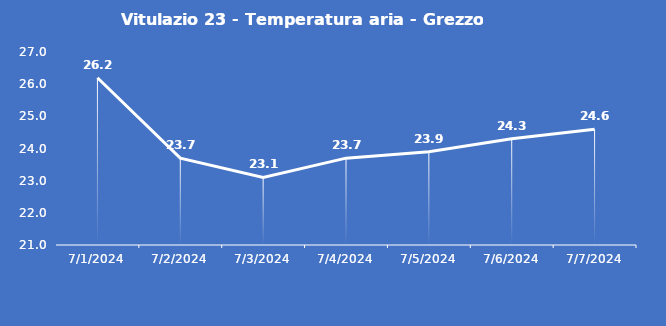
| Category | Vitulazio 23 - Temperatura aria - Grezzo (°C) |
|---|---|
| 7/1/24 | 26.2 |
| 7/2/24 | 23.7 |
| 7/3/24 | 23.1 |
| 7/4/24 | 23.7 |
| 7/5/24 | 23.9 |
| 7/6/24 | 24.3 |
| 7/7/24 | 24.6 |